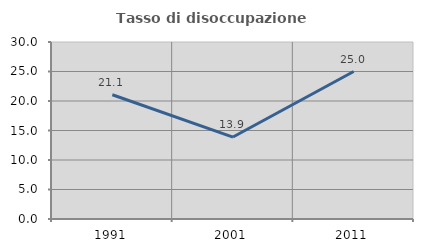
| Category | Tasso di disoccupazione giovanile  |
|---|---|
| 1991.0 | 21.053 |
| 2001.0 | 13.889 |
| 2011.0 | 25 |